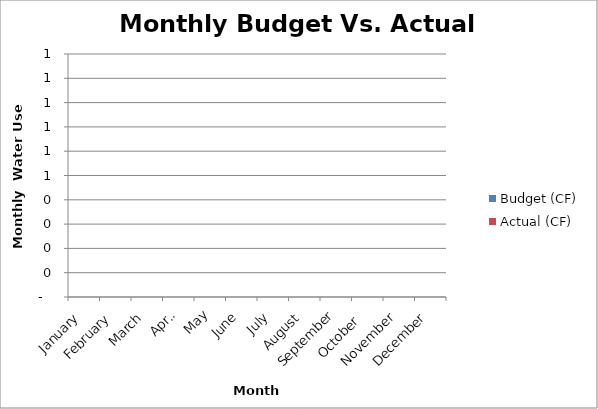
| Category | Budget (CF) | Actual (CF) |
|---|---|---|
| January | 0 | 0 |
| February | 0 | 0 |
| March | 0 | 0 |
| April | 0 | 0 |
| May | 0 | 0 |
| June | 0 | 0 |
| July | 0 | 0 |
| August | 0 | 0 |
| September | 0 | 0 |
| October  | 0 | 0 |
| November | 0 | 0 |
| December | 0 | 0 |